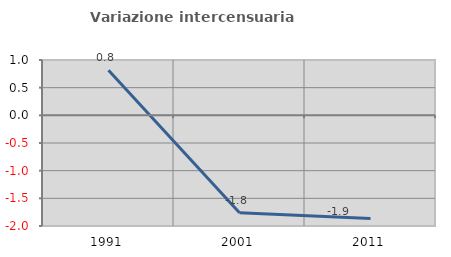
| Category | Variazione intercensuaria annua |
|---|---|
| 1991.0 | 0.813 |
| 2001.0 | -1.761 |
| 2011.0 | -1.866 |